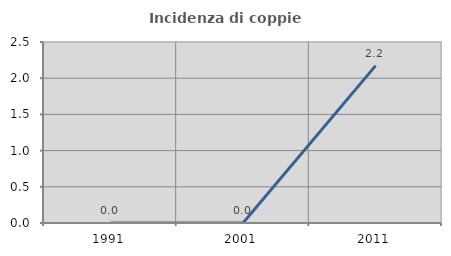
| Category | Incidenza di coppie miste |
|---|---|
| 1991.0 | 0 |
| 2001.0 | 0 |
| 2011.0 | 2.174 |